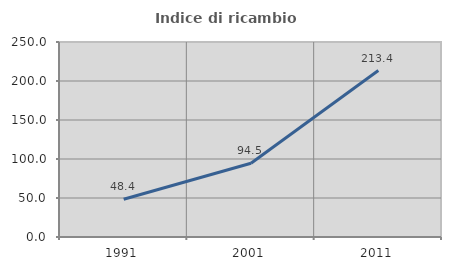
| Category | Indice di ricambio occupazionale  |
|---|---|
| 1991.0 | 48.41 |
| 2001.0 | 94.541 |
| 2011.0 | 213.447 |